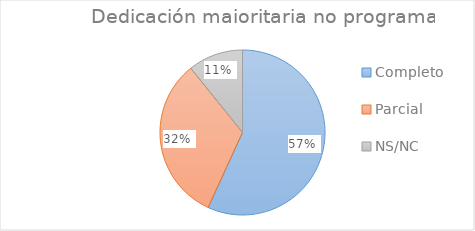
| Category | Series 0 |
|---|---|
| Completo | 0.568 |
| Parcial | 0.324 |
| NS/NC | 0.108 |